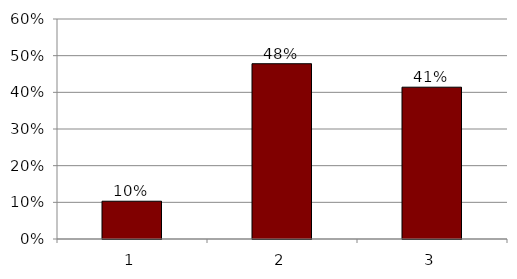
| Category | Series 0 |
|---|---|
| 1.0 | 0.103 |
| 2.0 | 0.478 |
| 3.0 | 0.414 |